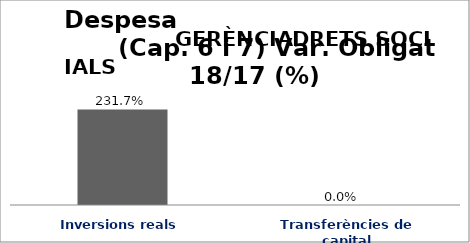
| Category | Series 0 |
|---|---|
| Inversions reals | 2.317 |
| Transferències de capital | 0 |